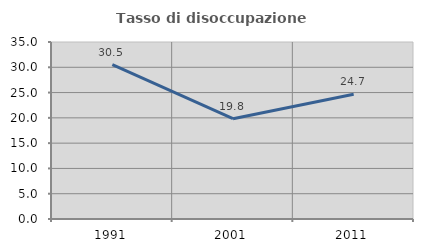
| Category | Tasso di disoccupazione giovanile  |
|---|---|
| 1991.0 | 30.508 |
| 2001.0 | 19.837 |
| 2011.0 | 24.653 |